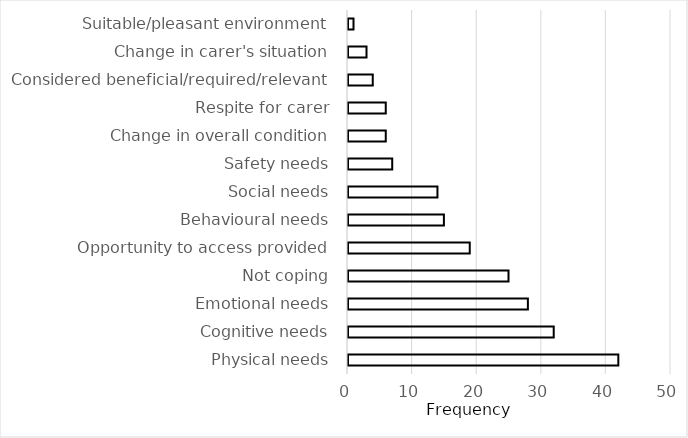
| Category | Reasons for accessing formal care services |
|---|---|
| Physical needs | 42 |
| Cognitive needs | 32 |
| Emotional needs | 28 |
| Not coping | 25 |
| Opportunity to access provided | 19 |
| Behavioural needs | 15 |
| Social needs | 14 |
| Safety needs | 7 |
| Change in overall condition | 6 |
| Respite for carer | 6 |
| Considered beneficial/required/relevant | 4 |
| Change in carer's situation | 3 |
| Suitable/pleasant environment | 1 |